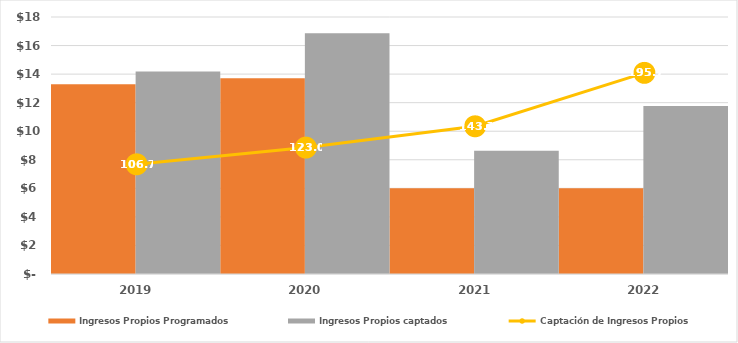
| Category | Ingresos Propios Programados | Ingresos Propios captados |
|---|---|---|
| 2019.0 | 13294.425 | 14184.195 |
| 2020.0 | 13709.89 | 16857.194 |
| 2021.0 | 6011.919 | 8637.676 |
| 2022.0 | 6011.919 | 11762.621 |